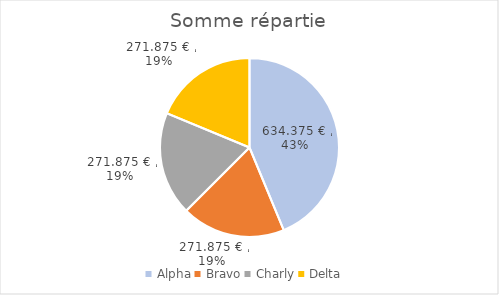
| Category | Somme |
|---|---|
| Alpha | 634.375 |
| Bravo | 271.875 |
| Charly | 271.875 |
| Delta | 271.875 |